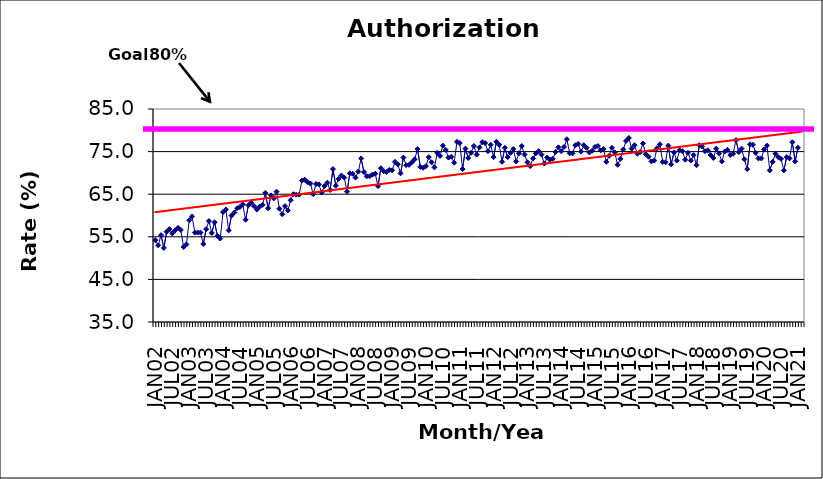
| Category | Series 0 |
|---|---|
| JAN02 | 54.2 |
| FEB02 | 53 |
| MAR02 | 55.4 |
| APR02 | 52.4 |
| MAY02 | 56.2 |
| JUN02 | 56.8 |
| JUL02 | 55.8 |
| AUG02 | 56.5 |
| SEP02 | 57.1 |
| OCT02 | 56.6 |
| NOV02 | 52.6 |
| DEC02 | 53.2 |
| JAN03 | 58.9 |
| FEB03 | 59.8 |
| MAR03 | 56 |
| APR03 | 56 |
| MAY03 | 56 |
| JUN03 | 53.3 |
| JUL03 | 56.8 |
| AUG03 | 58.7 |
| SEP03 | 55.9 |
| OCT03 | 58.4 |
| NOV03 | 55.2 |
| DEC03 | 54.6 |
| JAN04 | 60.8 |
| FEB04 | 61.4 |
| MAR04 | 56.5 |
| APR04 | 60 |
| MAY04 | 60.7 |
| JUN04 | 61.7 |
| JUL04 | 62 |
| AUG04 | 62.6 |
| SEP04 | 59 |
| OCT04 | 62.4 |
| NOV04 | 63 |
| DEC04 | 62.2 |
| JAN05 | 61.4 |
| FEB05 | 62.1 |
| MAR05 | 62.5 |
| APR05 | 65.3 |
| MAY05 | 61.7 |
| JUN05 | 64.7 |
| JUL05 | 64 |
| AUG05 | 65.6 |
| SEP05 | 61.6 |
| OCT05 | 60.3 |
| NOV05 | 62.2 |
| DEC05 | 61.2 |
| JAN06 | 63.6 |
| FEB06 | 65 |
| MAR06 | 64.9 |
| APR06 | 64.9 |
| MAY06 | 68.2 |
| JUN06 | 68.4 |
| JUL06 | 67.8 |
| AUG06 | 67.5 |
| SEP06 | 65 |
| OCT06 | 67.4 |
| NOV06 | 67.3 |
| DEC06 | 65.4 |
| JAN07 | 66.9 |
| FEB07 | 67.7 |
| MAR07 | 66 |
| APR07 | 70.9 |
| MAY07 | 67 |
| JUN07 | 68.6 |
| JUL07 | 69.4 |
| AUG07 | 68.9 |
| SEP07 | 65.6 |
| OCT07 | 69.9 |
| NOV07 | 69.8 |
| DEC07 | 68.9 |
| JAN08 | 70.3 |
| FEB08 | 73.4 |
| MAR08 | 70.2 |
| APR08 | 69.2 |
| MAY08 | 69.2 |
| JUN08 | 69.6 |
| JUL08 | 69.8 |
| AUG08 | 66.9 |
| SEP08 | 71.1 |
| OCT08 | 70.4 |
| NOV08 | 70.2 |
| DEC08 | 70.7 |
| JAN09 | 70.6 |
| FEB09 | 72.6 |
| MAR09 | 72 |
| APR09 | 69.9 |
| MAY09 | 73.6 |
| JUN09 | 71.8 |
| JUL09 | 71.9 |
| AUG09 | 72.5 |
| SEP09 | 73.2 |
| OCT09 | 75.6 |
| NOV09 | 71.4 |
| DEC09 | 71.2 |
| JAN10 | 71.6 |
| FEB10 | 73.7 |
| MAR10 | 72.5 |
| APR10 | 71.3 |
| MAY10 | 74.7 |
| JUN10 | 74 |
| JUL10 | 76.4 |
| AUG10 | 75.4 |
| SEP10 | 73.6 |
| OCT10 | 73.8 |
| NOV10 | 72.4 |
| DEC10 | 77.3 |
| JAN11 | 77 |
| FEB11 | 70.9 |
| MAR11 | 75.7 |
| APR11 | 73.5 |
| MAY11 | 74.7 |
| JUN11 | 76.3 |
| JUL11 | 74.3 |
| AUG11 | 76 |
| SEP11 | 77.2 |
| OCT11 | 77 |
| NOV11 | 75.1 |
| DEC11 | 76.6 |
| JAN12 | 73.7 |
| FEB12 | 77.3 |
| MAR12 | 76.6 |
| APR12 | 72.6 |
| MAY12 | 75.9 |
| JUN12 | 73.7 |
| JUL12 | 74.7 |
| AUG12 | 75.6 |
| SEP12 | 72.7 |
| OCT12 | 74.6 |
| NOV12 | 76.3 |
| DEC12 | 74.3 |
| JAN13 | 72.5 |
| FEB13 | 71.6 |
| MAR13 | 73.4 |
| APR13 | 74.6 |
| MAY13 | 75.1 |
| JUN13 | 74.3 |
| JUL13 | 72.2 |
| AUG13 | 73.6 |
| SEP13 | 73.1 |
| OCT13 | 73.3 |
| NOV13 | 74.9 |
| DEC13 | 76 |
| JAN14 | 75.1 |
| FEB14 | 76.1 |
| MAR14 | 77.9 |
| APR14 | 74.6 |
| MAY14 | 74.6 |
| JUN14 | 76.5 |
| JUL14 | 76.8 |
| AUG14 | 75 |
| SEP14 | 76.5 |
| OCT14 | 75.9 |
| NOV14 | 74.8 |
| DEC14 | 75.2 |
| JAN15 | 76.1 |
| FEB15 | 76.3 |
| MAR15 | 75.3 |
| APR15 | 75.6 |
| MAY15 | 72.6 |
| JUN15 | 74 |
| JUL15 | 75.9 |
| AUG15 | 74.8 |
| SEP15 | 71.9 |
| OCT15 | 73.3 |
| NOV15 | 75.5 |
| DEC15 | 77.5 |
| JAN16 | 78.2 |
| FEB16 | 75.7 |
| MAR16 | 76.5 |
| APR16 | 74.5 |
| MAY16 | 74.9 |
| JUN16 | 76.9 |
| JUL16 | 74.4 |
| AUG16 | 73.8 |
| SEP16 | 72.7 |
| OCT16 | 72.9 |
| NOV16 | 75.8 |
| DEC16 | 76.7 |
| JAN17 | 72.6 |
| FEB17 | 72.5 |
| MAR17 | 76.4 |
| APR17 | 72 |
| MAY17 | 74.8 |
| JUN17 | 72.9 |
| JUL17 | 75.3 |
| AUG17 | 75.1 |
| SEP17 | 73.1 |
| OCT17 | 74.7 |
| NOV17 | 72.9 |
| DEC17 | 74.2 |
| JAN18 | 71.8 |
| FEB18 | 76.5 |
| MAR18 | 76.2 |
| APR18 | 75.1 |
| MAY18 | 75.3 |
| JUN18 | 74.2 |
| JUL18 | 73.5 |
| AUG18 | 75.7 |
| SEP18 | 74.6 |
| OCT18 | 72.7 |
| NOV18 | 75 |
| DEC18 | 75.4 |
| JAN19 | 74.2 |
| FEB19 | 74.5 |
| MAR19 | 77.7 |
| APR19 | 74.9 |
| MAY19 | 75.7 |
| JUN19 | 73.2 |
| JUL19 | 70.9 |
| AUG19 | 76.7 |
| SEP19 | 76.6 |
| OCT19 | 74.7 |
| NOV19 | 73.4 |
| DEC19 | 73.4 |
| JAN20 | 75.5 |
| FEB20 | 76.4 |
| MAR20 | 70.6 |
| APR20 | 72.6 |
| MAY20 | 74.5 |
| JUN20 | 73.7 |
| JUL20 | 73.3 |
| AUG20 | 70.6 |
| SEP20 | 73.7 |
| OCT20 | 73.4 |
| NOV20 | 77.2 |
| DEC20 | 72.7 |
| JAN21 | 75.9 |